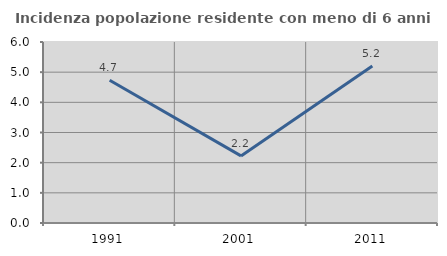
| Category | Incidenza popolazione residente con meno di 6 anni |
|---|---|
| 1991.0 | 4.731 |
| 2001.0 | 2.224 |
| 2011.0 | 5.201 |